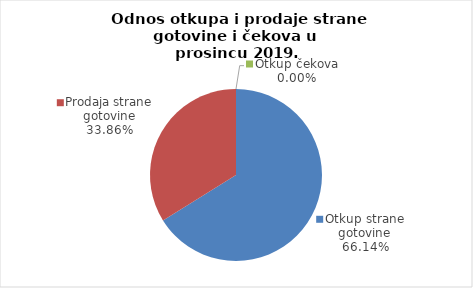
| Category | Series 0 |
|---|---|
| Otkup strane gotovine | 66.142 |
| Prodaja strane gotovine | 33.858 |
| Otkup čekova | 0 |